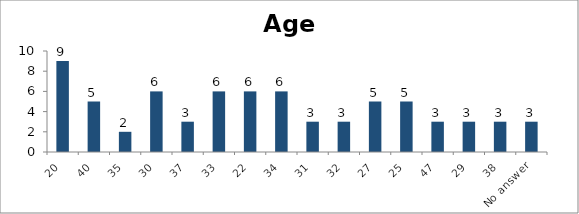
| Category | Age |
|---|---|
| 20 | 9 |
| 40 | 5 |
| 35 | 2 |
| 30 | 6 |
| 37 | 3 |
| 33 | 6 |
| 22 | 6 |
| 34 | 6 |
| 31 | 3 |
| 32 | 3 |
| 27 | 5 |
| 25 | 5 |
| 47 | 3 |
| 29 | 3 |
| 38 | 3 |
| No answer | 3 |